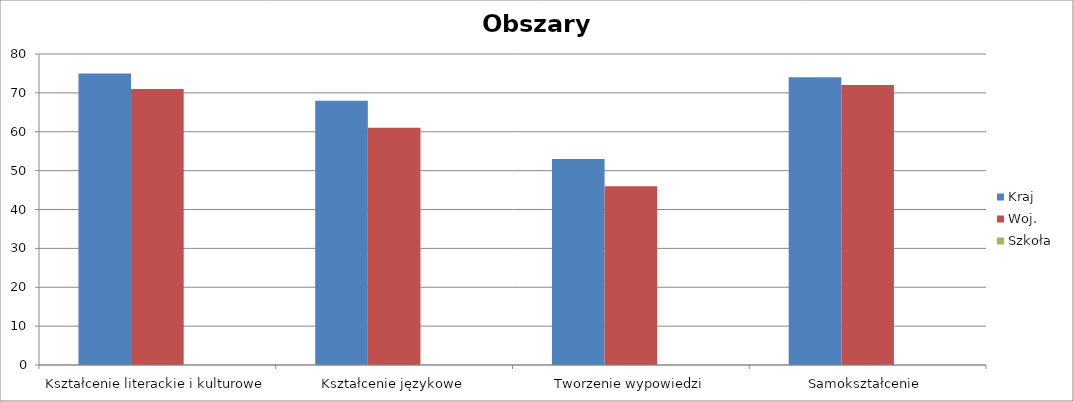
| Category | Kraj  | Woj. | Szkoła  |
|---|---|---|---|
| Kształcenie literackie i kulturowe | 75 | 71 | 0 |
| Kształcenie językowe | 68 | 61 | 0 |
| Tworzenie wypowiedzi | 53 | 46 | 0 |
| Samokształcenie  | 74 | 72 | 0 |